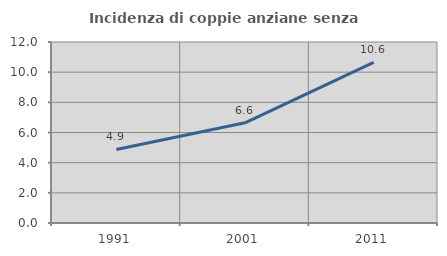
| Category | Incidenza di coppie anziane senza figli  |
|---|---|
| 1991.0 | 4.876 |
| 2001.0 | 6.641 |
| 2011.0 | 10.645 |